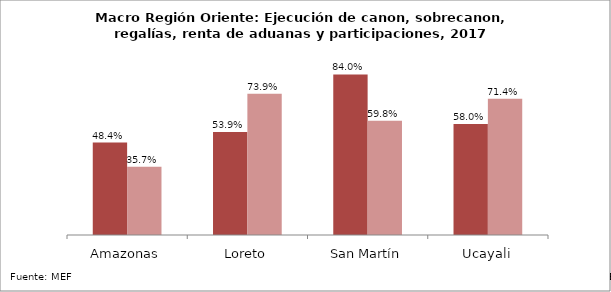
| Category | Series 0 | Series 1 |
|---|---|---|
| Amazonas | 0.484 | 0.357 |
| Loreto | 0.539 | 0.739 |
| San Martín | 0.84 | 0.598 |
| Ucayali | 0.58 | 0.714 |